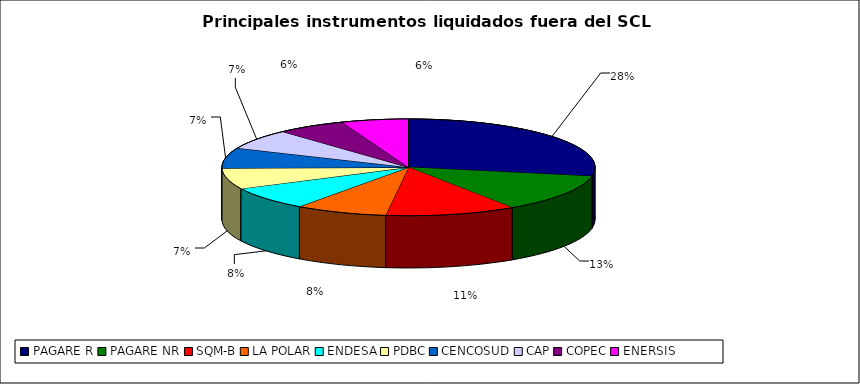
| Category | Series 0 |
|---|---|
| PAGARE R | 2537 |
| PAGARE NR | 1153 |
| SQM-B | 1027 |
| LA POLAR | 725 |
| ENDESA | 709 |
| PDBC | 634 |
| CENCOSUD | 616 |
| CAP | 609 |
| COPEC | 544 |
| ENERSIS | 525 |